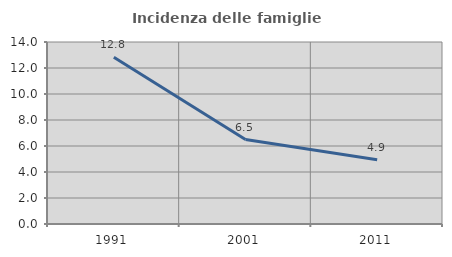
| Category | Incidenza delle famiglie numerose |
|---|---|
| 1991.0 | 12.82 |
| 2001.0 | 6.496 |
| 2011.0 | 4.938 |